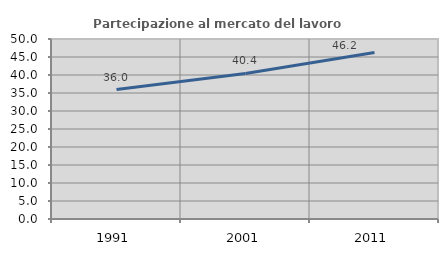
| Category | Partecipazione al mercato del lavoro  femminile |
|---|---|
| 1991.0 | 35.97 |
| 2001.0 | 40.426 |
| 2011.0 | 46.226 |